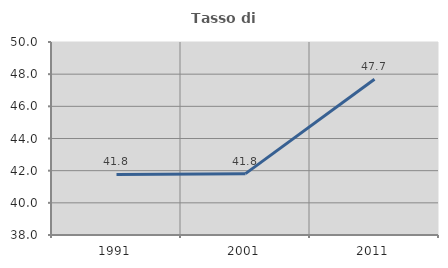
| Category | Tasso di occupazione   |
|---|---|
| 1991.0 | 41.763 |
| 2001.0 | 41.814 |
| 2011.0 | 47.689 |